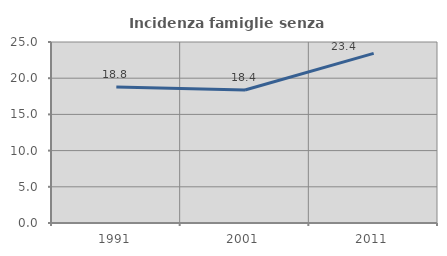
| Category | Incidenza famiglie senza nuclei |
|---|---|
| 1991.0 | 18.785 |
| 2001.0 | 18.364 |
| 2011.0 | 23.429 |